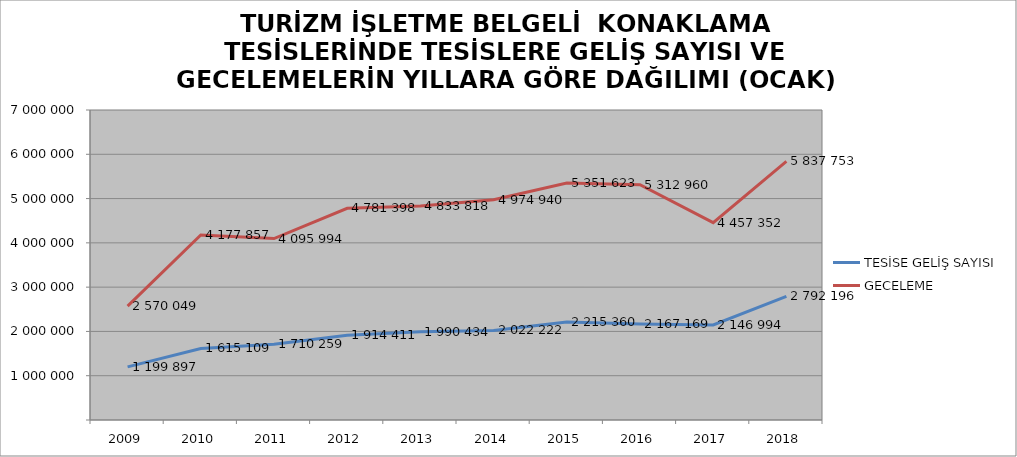
| Category | TESİSE GELİŞ SAYISI | GECELEME |
|---|---|---|
| 2009 | 1199897 | 2570049 |
| 2010 | 1615109 | 4177857 |
| 2011 | 1710259 | 4095994 |
| 2012 | 1914411 | 4781398 |
| 2013 | 1990434 | 4833818 |
| 2014 | 2022222 | 4974940 |
| 2015 | 2215360 | 5351623 |
| 2016 | 2167169 | 5312960 |
| 2017 | 2146994 | 4457352 |
| 2018 | 2792196 | 5837753 |